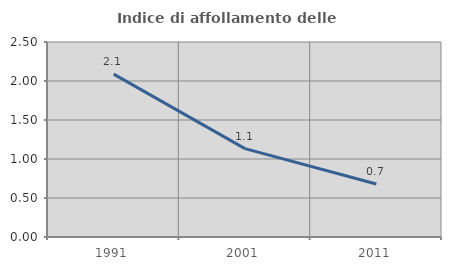
| Category | Indice di affollamento delle abitazioni  |
|---|---|
| 1991.0 | 2.087 |
| 2001.0 | 1.133 |
| 2011.0 | 0.68 |